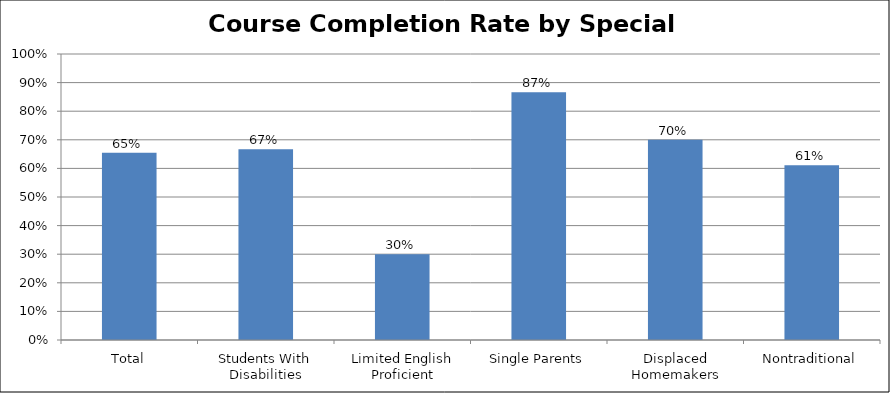
| Category | Completion Rate by Special Populations |
|---|---|
| Total | 0.655 |
| Students With Disabilities | 0.667 |
| Limited English Proficient | 0.3 |
| Single Parents | 0.867 |
| Displaced Homemakers | 0.7 |
| Nontraditional | 0.611 |